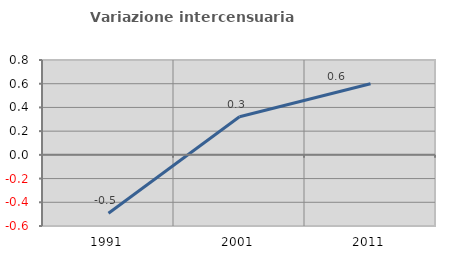
| Category | Variazione intercensuaria annua |
|---|---|
| 1991.0 | -0.492 |
| 2001.0 | 0.322 |
| 2011.0 | 0.6 |